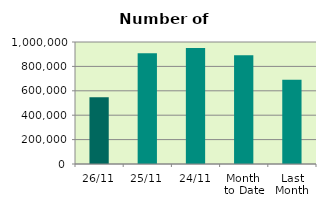
| Category | Series 0 |
|---|---|
| 26/11 | 546858 |
| 25/11 | 907162 |
| 24/11 | 949882 |
| Month 
to Date | 892093.053 |
| Last
Month | 689792.182 |